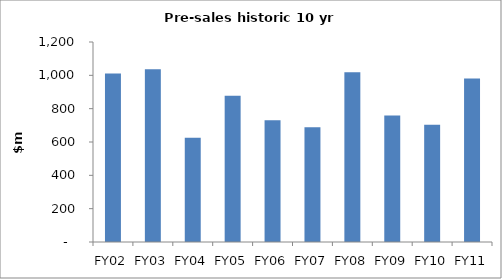
| Category | Series 0 |
|---|---|
| FY02 | 1011 |
| FY03 | 1036 |
| FY04 | 625 |
| FY05 | 877 |
| FY06 | 730 |
| FY07 | 689 |
| FY08 | 1018 |
| FY09 | 759 |
| FY10 | 704 |
| FY11 | 980.3 |